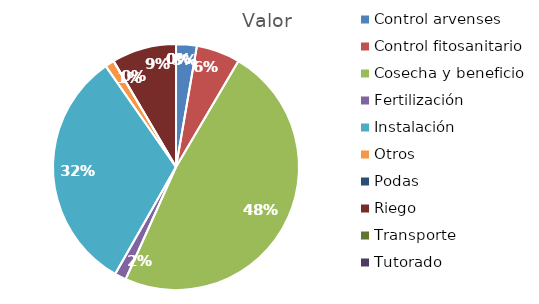
| Category | Valor |
|---|---|
| Control arvenses | 524997 |
| Control fitosanitario | 1108327 |
| Cosecha y beneficio | 9300600 |
| Fertilización | 291665 |
| Instalación | 6187161 |
| Otros | 233332 |
| Podas | 0 |
| Riego | 1633324 |
| Transporte | 0 |
| Tutorado | 0 |